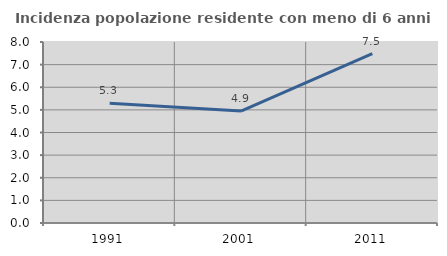
| Category | Incidenza popolazione residente con meno di 6 anni |
|---|---|
| 1991.0 | 5.295 |
| 2001.0 | 4.946 |
| 2011.0 | 7.484 |